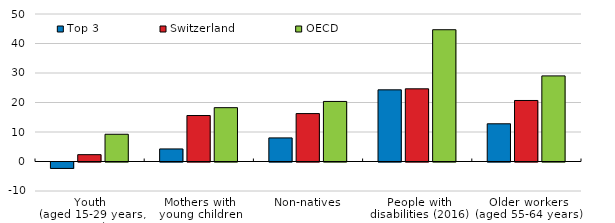
| Category | Top 3 | Switzerland | OECD |
|---|---|---|---|
| Youth
(aged 15-29 years, 2016) | -2.182 | 2.317 | 9.233 |
| Mothers with
young children | 4.255 | 15.588 | 18.251 |
| Non-natives | 7.995 | 16.239 | 20.356 |
| People with disabilities (2016) | 24.295 | 24.639 | 44.667 |
| Older workers
(aged 55-64 years) | 12.785 | 20.686 | 29.016 |